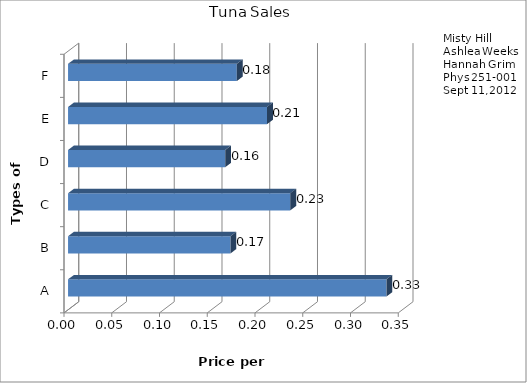
| Category | Price Per Ounce |
|---|---|
| A | 0.333 |
| B | 0.17 |
| C | 0.233 |
| D | 0.164 |
| E | 0.208 |
| F | 0.177 |